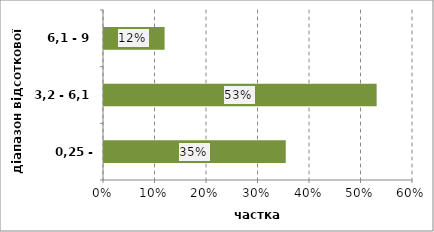
| Category | Series 0 |
|---|---|
| 0,25 - 3,2 | 0.353 |
| 3,2 - 6,1 | 0.529 |
| 6,1 - 9 | 0.118 |